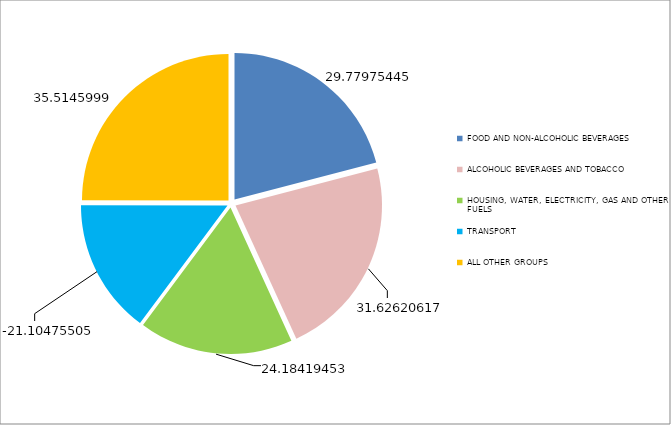
| Category | Series 0 |
|---|---|
| FOOD AND NON-ALCOHOLIC BEVERAGES  | 29.78 |
| ALCOHOLIC BEVERAGES AND TOBACCO | 31.626 |
| HOUSING, WATER, ELECTRICITY, GAS AND OTHER FUELS | 24.184 |
| TRANSPORT | -21.105 |
| ALL OTHER GROUPS | 35.515 |